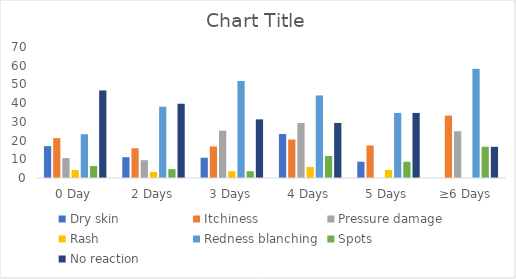
| Category | Dry skin | Itchiness | Pressure damage | Rash | Redness blanching | Spots | No reaction |
|---|---|---|---|---|---|---|---|
| 0 Day | 17.021 | 21.277 | 10.638 | 4.255 | 23.404 | 6.383 | 46.809 |
| 2 Days | 11.111 | 15.873 | 9.524 | 3.175 | 38.095 | 4.762 | 39.683 |
| 3 Days | 10.843 | 16.867 | 25.301 | 3.614 | 51.807 | 3.614 | 31.325 |
| 4 Days | 23.529 | 20.588 | 29.412 | 5.882 | 44.118 | 11.765 | 29.412 |
| 5 Days | 8.696 | 17.391 | 0 | 4.348 | 34.783 | 8.696 | 34.783 |
| ≥6 Days | 0 | 33.333 | 25 | 0 | 58.333 | 16.667 | 16.667 |